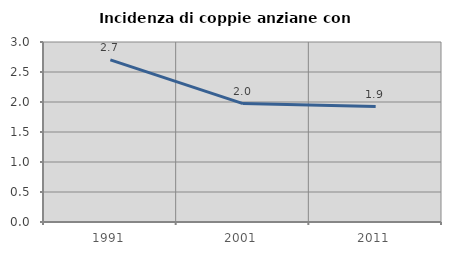
| Category | Incidenza di coppie anziane con figli |
|---|---|
| 1991.0 | 2.703 |
| 2001.0 | 1.974 |
| 2011.0 | 1.923 |